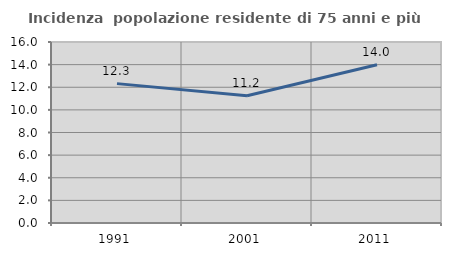
| Category | Incidenza  popolazione residente di 75 anni e più |
|---|---|
| 1991.0 | 12.321 |
| 2001.0 | 11.243 |
| 2011.0 | 13.984 |